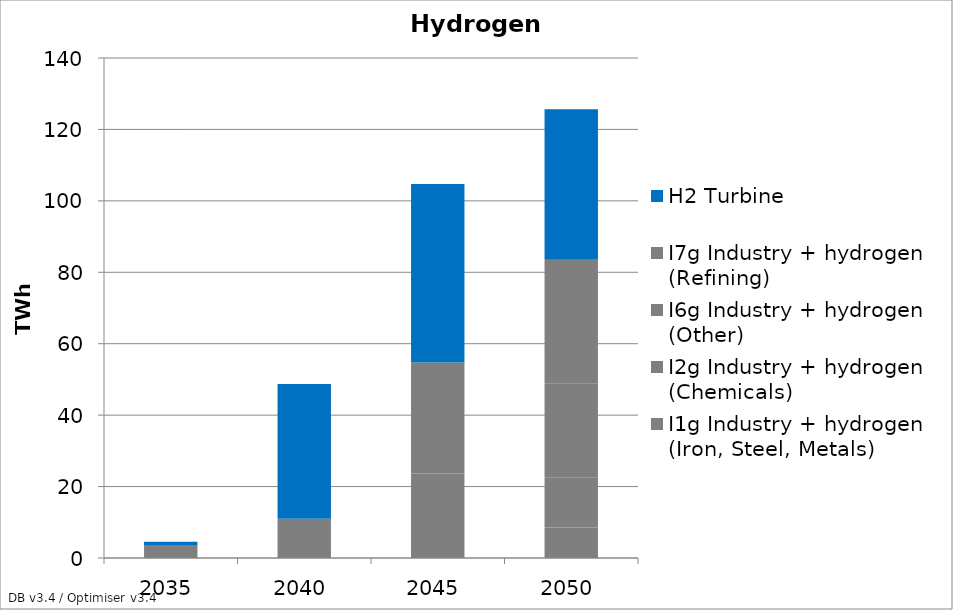
| Category | I1g Industry + hydrogen (Iron, Steel, Metals) | I2g Industry + hydrogen (Chemicals) | I6g Industry + hydrogen (Other) | I7g Industry + hydrogen (Refining) | H2 Turbine |
|---|---|---|---|---|---|
| 2035.0 | 0 | 0 | 3.65 | 0 | 0.921 |
| 2040.0 | 0 | 0 | 10.919 | 0.056 | 37.732 |
| 2045.0 | 8.681 | 15.013 | 28.082 | 2.962 | 49.983 |
| 2050.0 | 8.54 | 14.081 | 26.334 | 34.559 | 42.162 |